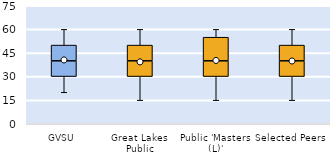
| Category | 25th | 50th | 75th |
|---|---|---|---|
| GVSU | 30 | 10 | 10 |
| Great Lakes Public | 30 | 10 | 10 |
| Public 'Masters (L)' | 30 | 10 | 15 |
| Selected Peers | 30 | 10 | 10 |